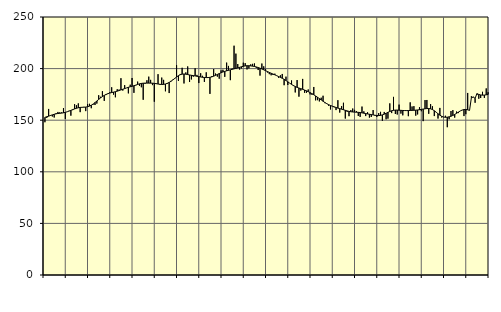
| Category | Piggar | Series 1 |
|---|---|---|
| nan | 148 | 152.79 |
| 1.0 | 152.2 | 153.33 |
| 1.0 | 160.9 | 153.91 |
| 1.0 | 154.2 | 154.57 |
| 1.0 | 153.6 | 155.17 |
| 1.0 | 152.6 | 155.74 |
| 1.0 | 156.8 | 156.18 |
| 1.0 | 158 | 156.48 |
| 1.0 | 157.6 | 156.65 |
| 1.0 | 157.6 | 156.87 |
| 1.0 | 161.7 | 157.16 |
| 1.0 | 151.2 | 157.6 |
| nan | 158.1 | 158.17 |
| 2.0 | 159.1 | 158.85 |
| 2.0 | 154.4 | 159.55 |
| 2.0 | 159.8 | 160.25 |
| 2.0 | 165.5 | 160.94 |
| 2.0 | 164.5 | 161.56 |
| 2.0 | 166.3 | 162.06 |
| 2.0 | 157.8 | 162.37 |
| 2.0 | 162.5 | 162.5 |
| 2.0 | 162.9 | 162.58 |
| 2.0 | 158.8 | 162.72 |
| 2.0 | 165.5 | 163.04 |
| nan | 165.9 | 163.64 |
| 3.0 | 161.6 | 164.52 |
| 3.0 | 165.1 | 165.67 |
| 3.0 | 164.7 | 167.08 |
| 3.0 | 166.1 | 168.61 |
| 3.0 | 174.2 | 170.14 |
| 3.0 | 172.7 | 171.59 |
| 3.0 | 178.1 | 172.9 |
| 3.0 | 168.7 | 174.04 |
| 3.0 | 174.4 | 174.97 |
| 3.0 | 176 | 175.72 |
| 3.0 | 177.1 | 176.33 |
| nan | 181.9 | 176.78 |
| 4.0 | 174.8 | 177.18 |
| 4.0 | 172.2 | 177.63 |
| 4.0 | 180 | 178.14 |
| 4.0 | 179.7 | 178.71 |
| 4.0 | 190.7 | 179.35 |
| 4.0 | 178.7 | 179.99 |
| 4.0 | 184 | 180.64 |
| 4.0 | 181.3 | 181.27 |
| 4.0 | 176 | 181.86 |
| 4.0 | 184.4 | 182.37 |
| 4.0 | 190.9 | 182.84 |
| nan | 176.5 | 183.38 |
| 5.0 | 183.7 | 184.01 |
| 5.0 | 187.4 | 184.65 |
| 5.0 | 183.3 | 185.22 |
| 5.0 | 181.9 | 185.63 |
| 5.0 | 169.8 | 185.84 |
| 5.0 | 185.2 | 185.94 |
| 5.0 | 188.7 | 185.95 |
| 5.0 | 192.2 | 185.94 |
| 5.0 | 189.1 | 185.92 |
| 5.0 | 184 | 185.86 |
| 5.0 | 167.9 | 185.68 |
| nan | 185.9 | 185.38 |
| 6.0 | 194.6 | 185.06 |
| 6.0 | 184.3 | 184.78 |
| 6.0 | 191.3 | 184.62 |
| 6.0 | 189.1 | 184.71 |
| 6.0 | 178 | 185.09 |
| 6.0 | 185.2 | 185.72 |
| 6.0 | 176.3 | 186.6 |
| 6.0 | 188.1 | 187.72 |
| 6.0 | 189.3 | 189.02 |
| 6.0 | 190.8 | 190.43 |
| 6.0 | 203.3 | 191.84 |
| nan | 188 | 193.14 |
| 7.0 | 194.8 | 194.1 |
| 7.0 | 200.8 | 194.63 |
| 7.0 | 185.6 | 194.77 |
| 7.0 | 196.3 | 194.58 |
| 7.0 | 202.1 | 194.21 |
| 7.0 | 187 | 193.83 |
| 7.0 | 189.5 | 193.51 |
| 7.0 | 192.2 | 193.23 |
| 7.0 | 200.3 | 192.92 |
| 7.0 | 193.9 | 192.57 |
| 7.0 | 186 | 192.22 |
| nan | 195.5 | 191.88 |
| 8.0 | 193 | 191.59 |
| 8.0 | 187.1 | 191.39 |
| 8.0 | 196.4 | 191.29 |
| 8.0 | 191.2 | 191.32 |
| 8.0 | 175.5 | 191.54 |
| 8.0 | 192.7 | 191.97 |
| 8.0 | 199.6 | 192.64 |
| 8.0 | 195.2 | 193.46 |
| 8.0 | 192.2 | 194.32 |
| 8.0 | 190.2 | 195.16 |
| 8.0 | 198.3 | 195.98 |
| nan | 198.9 | 196.73 |
| 9.0 | 192 | 197.34 |
| 9.0 | 205.8 | 197.86 |
| 9.0 | 202.6 | 198.34 |
| 9.0 | 188.8 | 198.8 |
| 9.0 | 200.1 | 199.28 |
| 9.0 | 222.2 | 199.77 |
| 9.0 | 214.5 | 200.23 |
| 9.0 | 204.4 | 200.69 |
| 9.0 | 199.1 | 201.22 |
| 9.0 | 200.2 | 201.77 |
| 9.0 | 205.7 | 202.26 |
| nan | 205.3 | 202.6 |
| 10.0 | 199.2 | 202.77 |
| 10.0 | 200.2 | 202.78 |
| 10.0 | 204.1 | 202.63 |
| 10.0 | 204.6 | 202.38 |
| 10.0 | 205 | 202.06 |
| 10.0 | 200.8 | 201.61 |
| 10.0 | 198.6 | 201.06 |
| 10.0 | 193.2 | 200.41 |
| 10.0 | 204.9 | 199.65 |
| 10.0 | 202.2 | 198.84 |
| 10.0 | 199.7 | 197.99 |
| nan | 196.2 | 197.14 |
| 11.0 | 194.6 | 196.31 |
| 11.0 | 193.5 | 195.52 |
| 11.0 | 193.8 | 194.74 |
| 11.0 | 195.1 | 193.96 |
| 11.0 | 193.3 | 193.14 |
| 11.0 | 191.1 | 192.32 |
| 11.0 | 193.5 | 191.51 |
| 11.0 | 194.8 | 190.61 |
| 11.0 | 183.9 | 189.59 |
| 11.0 | 192.2 | 188.42 |
| 11.0 | 184.1 | 187.17 |
| nan | 185.9 | 185.9 |
| 12.0 | 188.5 | 184.72 |
| 12.0 | 183.1 | 183.62 |
| 12.0 | 176.9 | 182.65 |
| 12.0 | 188.9 | 181.83 |
| 12.0 | 172.8 | 181.15 |
| 12.0 | 178.7 | 180.55 |
| 12.0 | 190 | 179.94 |
| 12.0 | 176.6 | 179.26 |
| 12.0 | 176.5 | 178.49 |
| 12.0 | 179.8 | 177.66 |
| 12.0 | 175 | 176.74 |
| nan | 174.6 | 175.74 |
| 13.0 | 182.2 | 174.64 |
| 13.0 | 169.2 | 173.47 |
| 13.0 | 169.4 | 172.23 |
| 13.0 | 168.2 | 170.95 |
| 13.0 | 171.8 | 169.65 |
| 13.0 | 173.7 | 168.37 |
| 13.0 | 166.5 | 167.13 |
| 13.0 | 166.3 | 166 |
| 13.0 | 164 | 165.06 |
| 13.0 | 160.4 | 164.28 |
| 13.0 | 163.4 | 163.6 |
| nan | 162.5 | 162.96 |
| 14.0 | 159.8 | 162.33 |
| 14.0 | 169.4 | 161.72 |
| 14.0 | 157.4 | 161.2 |
| 14.0 | 163.6 | 160.69 |
| 14.0 | 166.9 | 160.15 |
| 14.0 | 151.6 | 159.58 |
| 14.0 | 158.1 | 159.01 |
| 14.0 | 153.9 | 158.54 |
| 14.0 | 159.8 | 158.2 |
| 14.0 | 161.3 | 157.97 |
| 14.0 | 160 | 157.83 |
| nan | 158.8 | 157.74 |
| 15.0 | 154.1 | 157.62 |
| 15.0 | 153.2 | 157.42 |
| 15.0 | 163.2 | 157.14 |
| 15.0 | 158.6 | 156.79 |
| 15.0 | 154 | 156.41 |
| 15.0 | 157.7 | 156.06 |
| 15.0 | 152.5 | 155.76 |
| 15.0 | 153.1 | 155.47 |
| 15.0 | 159.8 | 155.13 |
| 15.0 | 154.3 | 154.79 |
| 15.0 | 153.1 | 154.54 |
| nan | 156.9 | 154.48 |
| 16.0 | 158.1 | 154.67 |
| 16.0 | 149.4 | 155.15 |
| 16.0 | 158 | 155.86 |
| 16.0 | 150.9 | 156.69 |
| 16.0 | 151.5 | 157.6 |
| 16.0 | 166.3 | 158.45 |
| 16.0 | 156.9 | 159.13 |
| 16.0 | 172.6 | 159.57 |
| 16.0 | 156 | 159.78 |
| 16.0 | 155.5 | 159.8 |
| 16.0 | 165.1 | 159.7 |
| nan | 156.4 | 159.54 |
| 17.0 | 154.7 | 159.42 |
| 17.0 | 159.1 | 159.35 |
| 17.0 | 159.6 | 159.32 |
| 17.0 | 153.9 | 159.35 |
| 17.0 | 167.3 | 159.44 |
| 17.0 | 163.3 | 159.53 |
| 17.0 | 163.6 | 159.61 |
| 17.0 | 154.4 | 159.72 |
| 17.0 | 155.6 | 159.9 |
| 17.0 | 162.6 | 160.17 |
| 17.0 | 158.7 | 160.49 |
| nan | 149.1 | 160.8 |
| 18.0 | 169.5 | 161.09 |
| 18.0 | 169.6 | 161.3 |
| 18.0 | 156.2 | 161.32 |
| 18.0 | 165.6 | 161.02 |
| 18.0 | 163.5 | 160.31 |
| 18.0 | 154 | 159.17 |
| 18.0 | 157.8 | 157.75 |
| 18.0 | 151.6 | 156.25 |
| 18.0 | 161.9 | 154.88 |
| 18.0 | 152.6 | 153.77 |
| 18.0 | 153 | 153.05 |
| nan | 154.3 | 152.82 |
| 19.0 | 143.2 | 152.93 |
| 19.0 | 150.9 | 153.27 |
| 19.0 | 158.9 | 153.84 |
| 19.0 | 159.8 | 154.62 |
| 19.0 | 152.5 | 155.58 |
| 19.0 | 158.4 | 156.68 |
| 19.0 | 156.9 | 157.85 |
| 19.0 | 158.9 | 158.94 |
| 19.0 | 159.9 | 159.8 |
| 19.0 | 154 | 160.3 |
| 19.0 | 155.8 | 160.4 |
| nan | 176.4 | 160.09 |
| 20.0 | 159.4 | 159.46 |
| 20.0 | 173.2 | 171.89 |
| 20.0 | 172.7 | 172.32 |
| 20.0 | 166.9 | 171.24 |
| 20.0 | 174.6 | 175.71 |
| 20.0 | 170.8 | 174.96 |
| 20.0 | 171.5 | 174.47 |
| 20.0 | 177.5 | 174.28 |
| 20.0 | 171.6 | 174.35 |
| 20.0 | 180.8 | 174.61 |
| 20.0 | 177.1 | 174.94 |